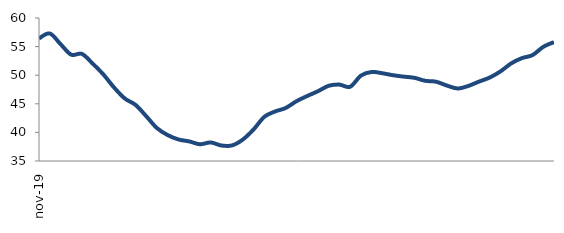
| Category | Series 0 |
|---|---|
| 2019-11-01 | 56.425 |
| 2019-12-01 | 57.298 |
| 2020-01-01 | 55.449 |
| 2020-02-01 | 53.592 |
| 2020-03-01 | 53.724 |
| 2020-04-01 | 52.032 |
| 2020-05-01 | 50.132 |
| 2020-06-01 | 47.839 |
| 2020-07-01 | 45.923 |
| 2020-08-01 | 44.807 |
| 2020-09-01 | 42.819 |
| 2020-10-01 | 40.739 |
| 2020-11-01 | 39.526 |
| 2020-12-01 | 38.764 |
| 2021-01-01 | 38.426 |
| 2021-02-01 | 37.926 |
| 2021-03-01 | 38.241 |
| 2021-04-01 | 37.709 |
| 2021-05-01 | 37.728 |
| 2021-06-01 | 38.756 |
| 2021-07-01 | 40.518 |
| 2021-08-01 | 42.719 |
| 2021-09-01 | 43.654 |
| 2021-10-01 | 44.278 |
| 2021-11-01 | 45.454 |
| 2021-12-01 | 46.366 |
| 2022-01-01 | 47.2 |
| 2022-02-01 | 48.15 |
| 2022-03-01 | 48.353 |
| 2022-04-01 | 47.979 |
| 2022-05-01 | 49.924 |
| 2022-06-01 | 50.56 |
| 2022-07-01 | 50.34 |
| 2022-08-01 | 49.995 |
| 2022-09-01 | 49.749 |
| 2022-10-01 | 49.539 |
| 2022-11-01 | 49.017 |
| 2022-12-01 | 48.863 |
| 2023-01-01 | 48.201 |
| 2023-02-01 | 47.68 |
| 2023-03-01 | 48.113 |
| 2023-04-01 | 48.873 |
| 2023-05-01 | 49.582 |
| 2023-06-01 | 50.651 |
| 2023-07-01 | 52.053 |
| 2023-08-01 | 52.98 |
| 2023-09-01 | 53.515 |
| 2023-10-01 | 54.955 |
| 2023-11-01 | 55.788 |